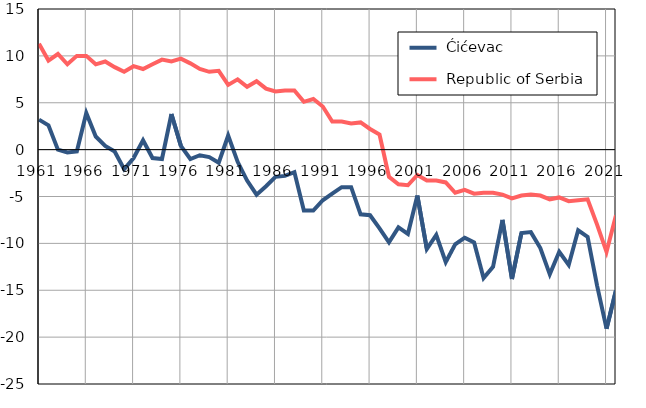
| Category |  Ćićevac |  Republic of Serbia |
|---|---|---|
| 1961.0 | 3.2 | 11.3 |
| 1962.0 | 2.6 | 9.5 |
| 1963.0 | 0 | 10.2 |
| 1964.0 | -0.3 | 9.1 |
| 1965.0 | -0.2 | 10 |
| 1966.0 | 3.9 | 10 |
| 1967.0 | 1.4 | 9.1 |
| 1968.0 | 0.4 | 9.4 |
| 1969.0 | -0.2 | 8.8 |
| 1970.0 | -2.1 | 8.3 |
| 1971.0 | -0.9 | 8.9 |
| 1972.0 | 1 | 8.6 |
| 1973.0 | -0.9 | 9.1 |
| 1974.0 | -1 | 9.6 |
| 1975.0 | 3.8 | 9.4 |
| 1976.0 | 0.4 | 9.7 |
| 1977.0 | -1 | 9.2 |
| 1978.0 | -0.6 | 8.6 |
| 1979.0 | -0.8 | 8.3 |
| 1980.0 | -1.4 | 8.4 |
| 1981.0 | 1.5 | 6.9 |
| 1982.0 | -1.3 | 7.5 |
| 1983.0 | -3.3 | 6.7 |
| 1984.0 | -4.8 | 7.3 |
| 1985.0 | -3.9 | 6.5 |
| 1986.0 | -2.9 | 6.2 |
| 1987.0 | -2.8 | 6.3 |
| 1988.0 | -2.4 | 6.3 |
| 1989.0 | -6.5 | 5.1 |
| 1990.0 | -6.5 | 5.4 |
| 1991.0 | -5.4 | 4.6 |
| 1992.0 | -4.7 | 3 |
| 1993.0 | -4 | 3 |
| 1994.0 | -4 | 2.8 |
| 1995.0 | -6.9 | 2.9 |
| 1996.0 | -7 | 2.2 |
| 1997.0 | -8.4 | 1.6 |
| 1998.0 | -9.9 | -2.9 |
| 1999.0 | -8.3 | -3.7 |
| 2000.0 | -9 | -3.8 |
| 2001.0 | -4.9 | -2.7 |
| 2002.0 | -10.6 | -3.3 |
| 2003.0 | -9.1 | -3.3 |
| 2004.0 | -12 | -3.5 |
| 2005.0 | -10.1 | -4.6 |
| 2006.0 | -9.4 | -4.3 |
| 2007.0 | -9.9 | -4.7 |
| 2008.0 | -13.7 | -4.6 |
| 2009.0 | -12.5 | -4.6 |
| 2010.0 | -7.5 | -4.8 |
| 2011.0 | -13.8 | -5.2 |
| 2012.0 | -8.9 | -4.9 |
| 2013.0 | -8.8 | -4.8 |
| 2014.0 | -10.5 | -4.9 |
| 2015.0 | -13.3 | -5.3 |
| 2016.0 | -10.9 | -5.1 |
| 2017.0 | -12.3 | -5.5 |
| 2018.0 | -8.6 | -5.4 |
| 2019.0 | -9.3 | -5.3 |
| 2020.0 | -14.5 | -8 |
| 2021.0 | -19.1 | -10.9 |
| 2022.0 | -15 | -7 |